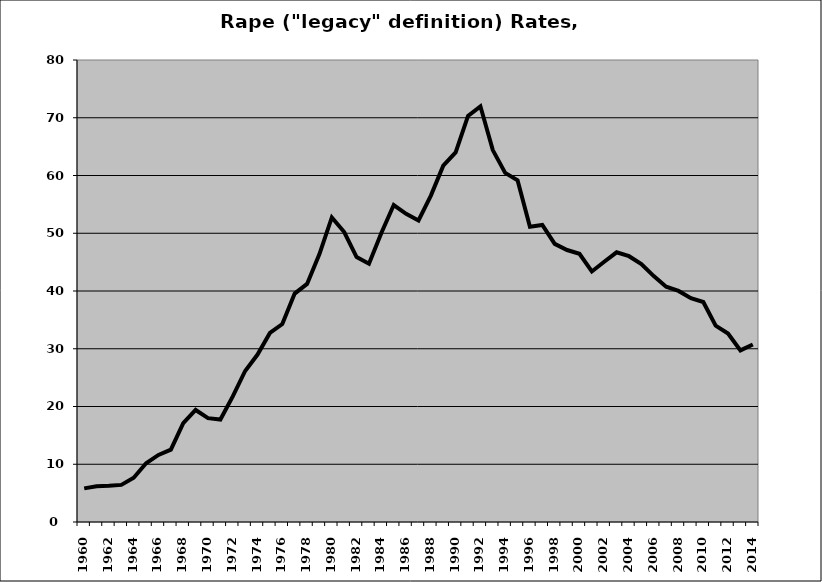
| Category | Rape |
|---|---|
| 1960.0 | 5.818 |
| 1961.0 | 6.203 |
| 1962.0 | 6.287 |
| 1963.0 | 6.426 |
| 1964.0 | 7.674 |
| 1965.0 | 10.167 |
| 1966.0 | 11.611 |
| 1967.0 | 12.536 |
| 1968.0 | 17.125 |
| 1969.0 | 19.4 |
| 1970.0 | 17.981 |
| 1971.0 | 17.744 |
| 1972.0 | 21.754 |
| 1973.0 | 26.159 |
| 1974.0 | 28.999 |
| 1975.0 | 32.731 |
| 1976.0 | 34.275 |
| 1977.0 | 39.557 |
| 1978.0 | 41.229 |
| 1979.0 | 46.383 |
| 1980.0 | 52.731 |
| 1981.0 | 50.214 |
| 1982.0 | 45.866 |
| 1983.0 | 44.721 |
| 1984.0 | 50.034 |
| 1985.0 | 54.888 |
| 1986.0 | 53.372 |
| 1987.0 | 52.226 |
| 1988.0 | 56.527 |
| 1989.0 | 61.71 |
| 1990.0 | 64.007 |
| 1991.0 | 70.327 |
| 1992.0 | 71.982 |
| 1993.0 | 64.396 |
| 1994.0 | 60.453 |
| 1995.0 | 59.179 |
| 1996.0 | 51.112 |
| 1997.0 | 51.426 |
| 1998.0 | 48.163 |
| 1999.0 | 47.096 |
| 2000.0 | 46.436 |
| 2001.0 | 43.381 |
| 2002.0 | 45.063 |
| 2003.0 | 46.695 |
| 2004.0 | 46.028 |
| 2005.0 | 44.676 |
| 2006.0 | 42.575 |
| 2007.0 | 40.752 |
| 2008.0 | 40.009 |
| 2009.0 | 38.759 |
| 2010.0 | 38.099 |
| 2011.0 | 34.001 |
| 2012.0 | 32.631 |
| 2013.0 | 29.711 |
| 2014.0 | 30.744 |